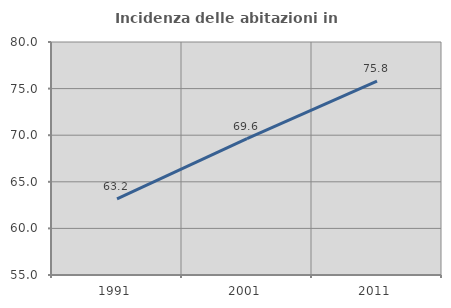
| Category | Incidenza delle abitazioni in proprietà  |
|---|---|
| 1991.0 | 63.174 |
| 2001.0 | 69.639 |
| 2011.0 | 75.79 |